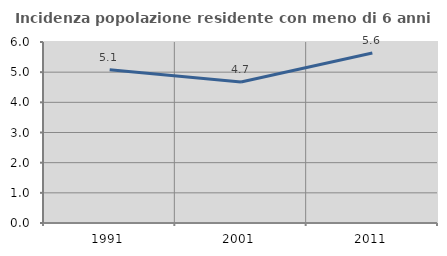
| Category | Incidenza popolazione residente con meno di 6 anni |
|---|---|
| 1991.0 | 5.084 |
| 2001.0 | 4.672 |
| 2011.0 | 5.637 |